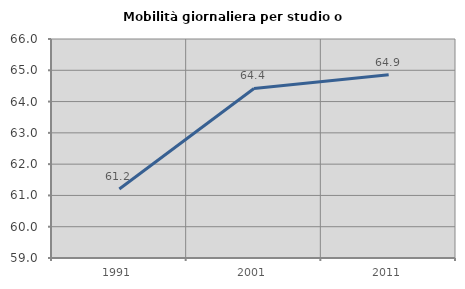
| Category | Mobilità giornaliera per studio o lavoro |
|---|---|
| 1991.0 | 61.207 |
| 2001.0 | 64.42 |
| 2011.0 | 64.855 |